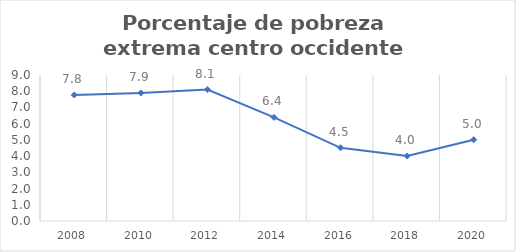
| Category | Series 0 |
|---|---|
| 2008.0 | 7.771 |
| 2010.0 | 7.895 |
| 2012.0 | 8.102 |
| 2014.0 | 6.386 |
| 2016.0 | 4.512 |
| 2018.0 | 4.004 |
| 2020.0 | 5.011 |